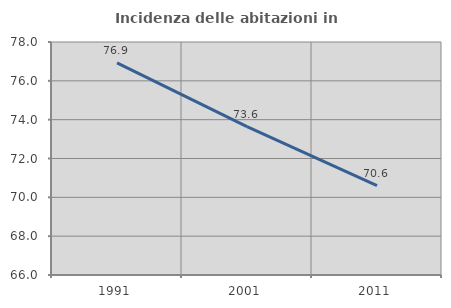
| Category | Incidenza delle abitazioni in proprietà  |
|---|---|
| 1991.0 | 76.929 |
| 2001.0 | 73.641 |
| 2011.0 | 70.603 |